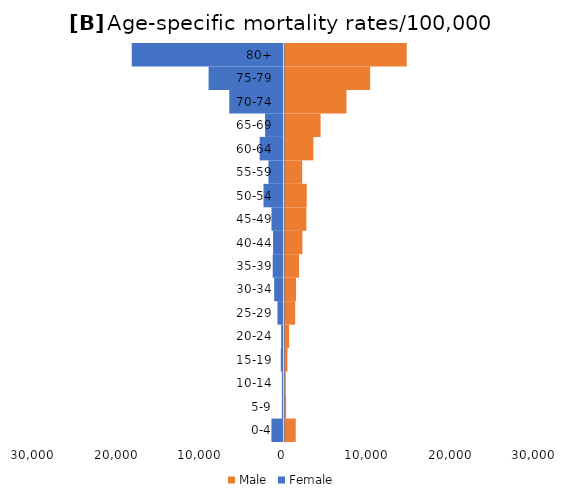
| Category | Male | Female |
|---|---|---|
| 0-4 | 1348.055 | -1444.979 |
| 5-9 | 192.308 | -191.785 |
| 10-14 | 154.047 | -190.493 |
| 15-19 | 356.921 | -321.09 |
| 20-24 | 555.428 | -279.596 |
| 25-29 | 1278.677 | -721.177 |
| 30-34 | 1383.108 | -1112.437 |
| 35-39 | 1737.688 | -1293.27 |
| 40-44 | 2141.61 | -1251.211 |
| 45-49 | 2621.418 | -1442.388 |
| 50-54 | 2661.679 | -2397.15 |
| 55-59 | 2114.917 | -1805.957 |
| 60-64 | 3463.664 | -2854.116 |
| 65-69 | 4319.913 | -2208.685 |
| 70-74 | 7419.806 | -6494.484 |
| 75-79 | 10257.766 | -8969.272 |
| 80+ | 14637.4 | -18176.27 |